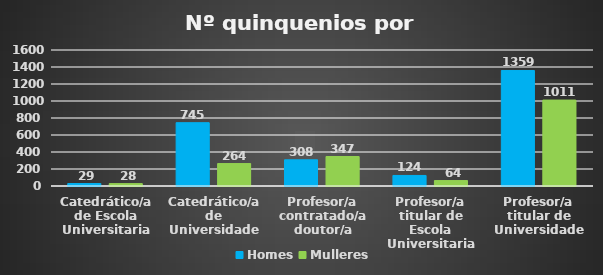
| Category | Homes | Mulleres |
|---|---|---|
| Catedrático/a de Escola Universitaria | 29 | 28 |
| Catedrático/a de Universidade | 745 | 264 |
| Profesor/a contratado/a doutor/a | 308 | 347 |
| Profesor/a titular de Escola Universitaria | 124 | 64 |
| Profesor/a titular de Universidade | 1359 | 1011 |